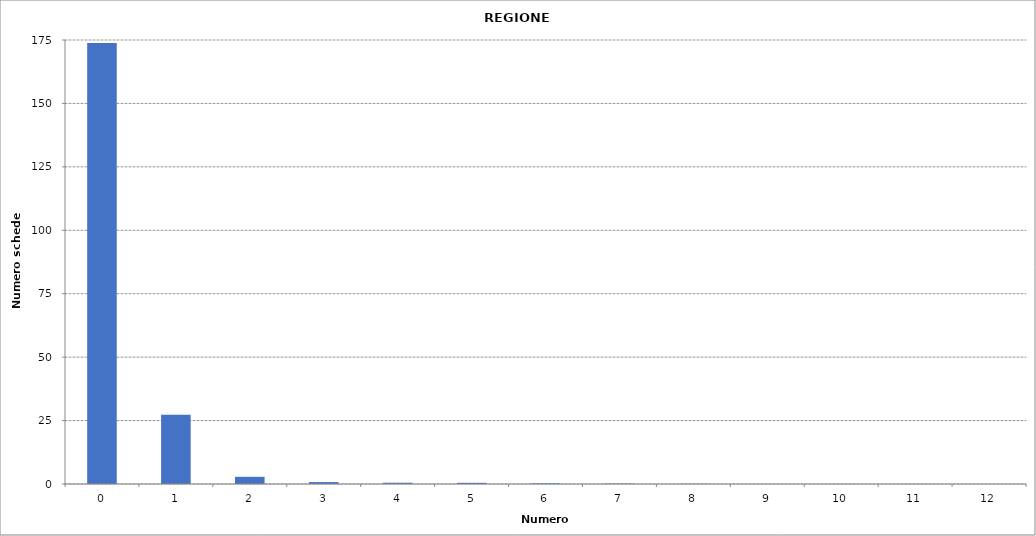
| Category | Series 0 |
|---|---|
| 0.0 | 173811 |
| 1.0 | 27327 |
| 2.0 | 2831 |
| 3.0 | 760 |
| 4.0 | 503 |
| 5.0 | 466 |
| 6.0 | 257 |
| 7.0 | 145 |
| 8.0 | 92 |
| 9.0 | 29 |
| 10.0 | 32 |
| 11.0 | 32 |
| 12.0 | 3 |